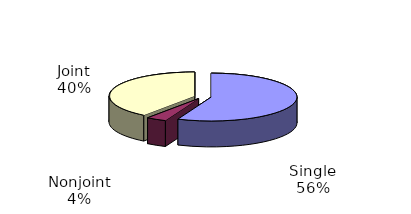
| Category | Series 0 |
|---|---|
| Single | 2060318 |
| Separate | 139211 |
| Joint | 1457145 |